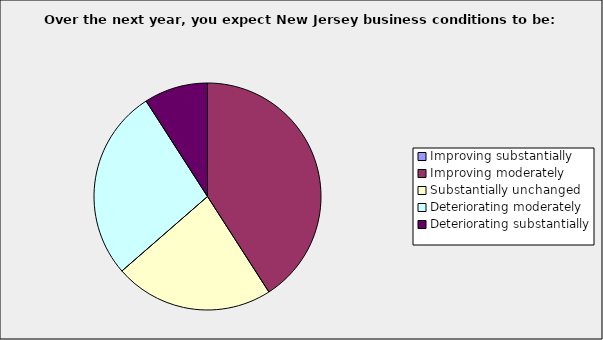
| Category | Series 0 |
|---|---|
| Improving substantially | 0 |
| Improving moderately | 0.409 |
| Substantially unchanged | 0.227 |
| Deteriorating moderately | 0.273 |
| Deteriorating substantially | 0.091 |